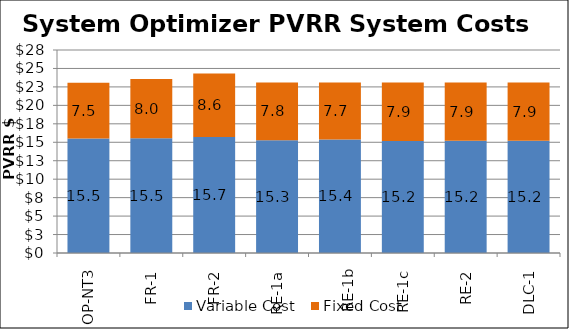
| Category | Variable Cost | Fixed Cost |
|---|---|---|
| OP-NT3 | 15.518 | 7.534 |
| FR-1 | 15.54 | 8.045 |
| FR-2 | 15.729 | 8.59 |
| RE-1a | 15.268 | 7.814 |
| 
RE-1b | 15.369 | 7.722 |
| RE-1c | 15.187 | 7.923 |
| RE-2 | 15.2 | 7.898 |
| DLC-1 | 15.217 | 7.886 |